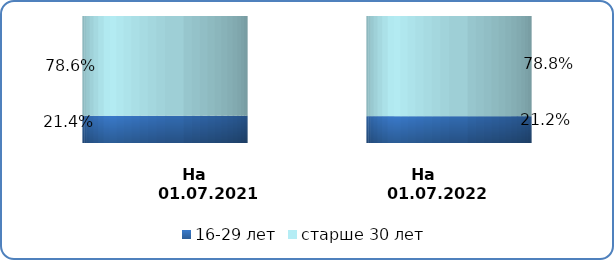
| Category | 16-29 лет | старше 30 лет |
|---|---|---|
| на 
01.07.2021 | 0.214 | 0.786 |
| на 
01.07.2022 | 0.212 | 0.788 |